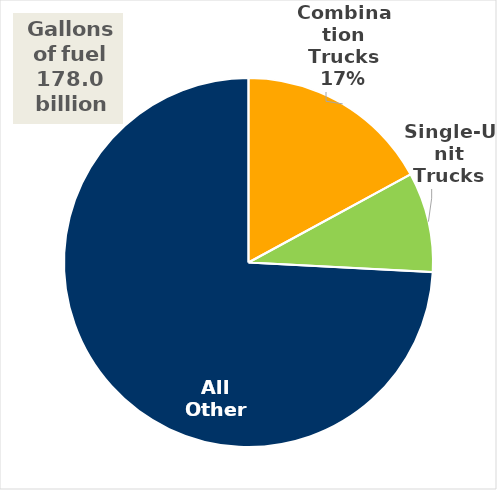
| Category | Fuel Use (Billion Gallons) |
|---|---|
| Combination Trucks | 30.364 |
| Single-Unit Trucks | 15.6 |
| All Other | 131.988 |